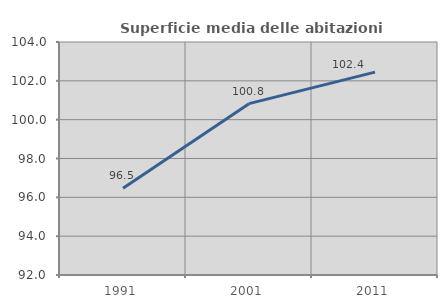
| Category | Superficie media delle abitazioni occupate |
|---|---|
| 1991.0 | 96.464 |
| 2001.0 | 100.826 |
| 2011.0 | 102.447 |